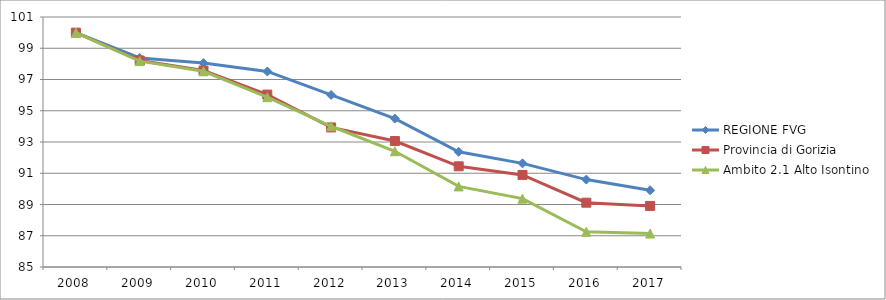
| Category | REGIONE FVG | Provincia di Gorizia | Ambito 2.1 Alto Isontino |
|---|---|---|---|
| 2008.0 | 100 | 100 | 100 |
| 2009.0 | 98.378 | 98.214 | 98.176 |
| 2010.0 | 98.049 | 97.573 | 97.525 |
| 2011.0 | 97.515 | 96.033 | 95.869 |
| 2012.0 | 96.012 | 93.931 | 94.008 |
| 2013.0 | 94.5 | 93.063 | 92.408 |
| 2014.0 | 92.37 | 91.445 | 90.156 |
| 2015.0 | 91.632 | 90.892 | 89.375 |
| 2016.0 | 90.595 | 89.116 | 87.253 |
| 2017.0 | 89.908 | 88.909 | 87.142 |